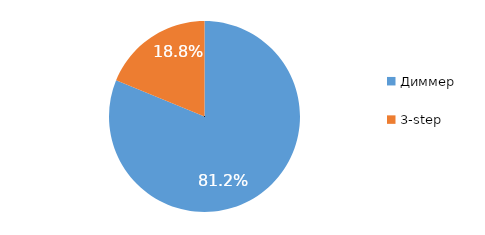
| Category | Series 0 |
|---|---|
| Диммер | 0.812 |
| 3-step | 0.188 |
| Не определено | 0 |